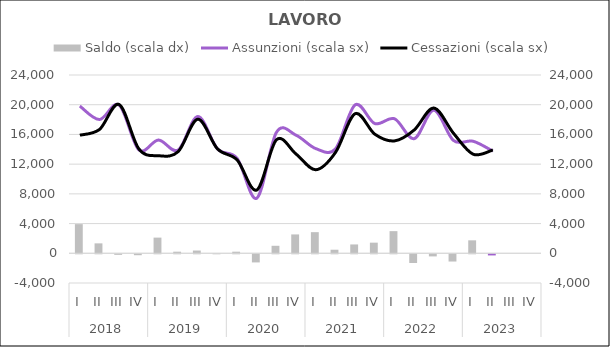
| Category | Saldo (scala dx) |
|---|---|
| 0 | 3925 |
| 1 | 1335 |
| 2 | -75 |
| 3 | -125 |
| 4 | 2110 |
| 5 | 215 |
| 6 | 370 |
| 7 | 5 |
| 8 | 215 |
| 9 | -1095 |
| 10 | 1010 |
| 11 | 2540 |
| 12 | 2845 |
| 13 | 480 |
| 14 | 1190 |
| 15 | 1430 |
| 16 | 2980 |
| 17 | -1170 |
| 18 | -285 |
| 19 | -975 |
| 20 | 1745 |
| 21 | -155 |
| 22 | 0 |
| 23 | 0 |